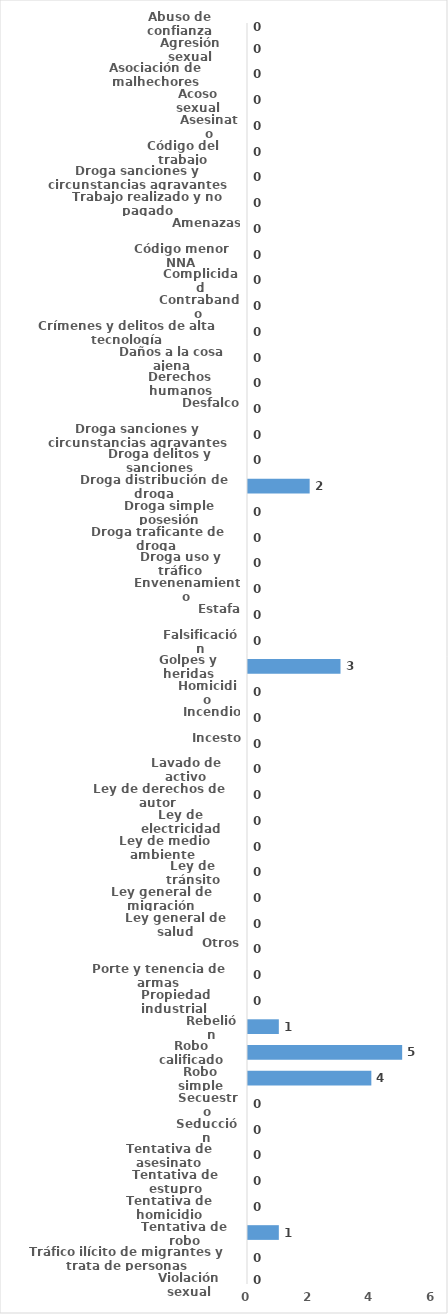
| Category | Series 0 |
|---|---|
| Abuso de confianza | 0 |
| Agresión sexual | 0 |
| Asociación de malhechores | 0 |
| Acoso sexual | 0 |
| Asesinato | 0 |
| Código del trabajo | 0 |
| Droga sanciones y circunstancias agravantes | 0 |
| Trabajo realizado y no pagado | 0 |
| Amenazas | 0 |
| Código menor NNA | 0 |
| Complicidad | 0 |
| Contrabando | 0 |
| Crímenes y delitos de alta tecnología | 0 |
| Daños a la cosa ajena | 0 |
| Derechos humanos | 0 |
| Desfalco | 0 |
| Droga sanciones y circunstancias agravantes | 0 |
| Droga delitos y sanciones | 0 |
| Droga distribución de droga | 2 |
| Droga simple posesión | 0 |
| Droga traficante de droga  | 0 |
| Droga uso y tráfico | 0 |
| Envenenamiento | 0 |
| Estafa | 0 |
| Falsificación | 0 |
| Golpes y heridas | 3 |
| Homicidio | 0 |
| Incendio | 0 |
| Incesto | 0 |
| Lavado de activo | 0 |
| Ley de derechos de autor  | 0 |
| Ley de electricidad | 0 |
| Ley de medio ambiente  | 0 |
| Ley de tránsito | 0 |
| Ley general de migración | 0 |
| Ley general de salud | 0 |
| Otros | 0 |
| Porte y tenencia de armas | 0 |
| Propiedad industrial  | 0 |
| Rebelión | 1 |
| Robo calificado | 5 |
| Robo simple | 4 |
| Secuestro | 0 |
| Seducción | 0 |
| Tentativa de asesinato | 0 |
| Tentativa de estupro | 0 |
| Tentativa de homicidio | 0 |
| Tentativa de robo | 1 |
| Tráfico ilícito de migrantes y trata de personas | 0 |
| Violación sexual | 0 |